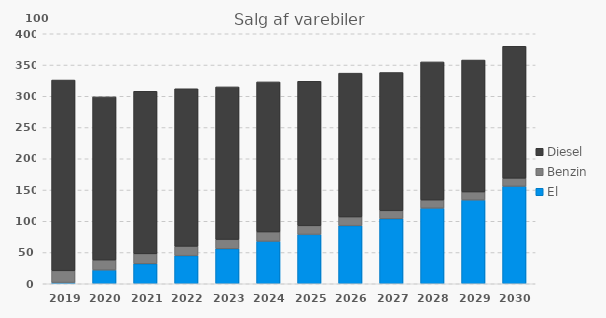
| Category | El | Benzin | Diesel |
|---|---|---|---|
| 2019 | 2 | 19 | 305 |
| 2020 | 22 | 16 | 261 |
| 2021 | 32 | 16 | 260 |
| 2022 | 45 | 15 | 252 |
| 2023 | 56 | 15 | 244 |
| 2024 | 68 | 15 | 240 |
| 2025 | 79 | 14 | 231 |
| 2026 | 93 | 14 | 230 |
| 2027 | 104 | 13 | 221 |
| 2028 | 121 | 13 | 221 |
| 2029 | 134 | 13 | 211 |
| 2030 | 156 | 13 | 211 |